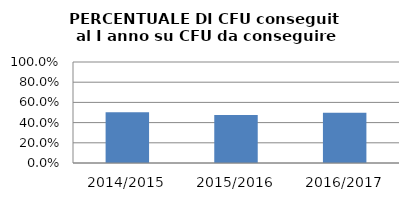
| Category | 2014/2015 2015/2016 2016/2017 |
|---|---|
| 2014/2015 | 0.503 |
| 2015/2016 | 0.475 |
| 2016/2017 | 0.498 |